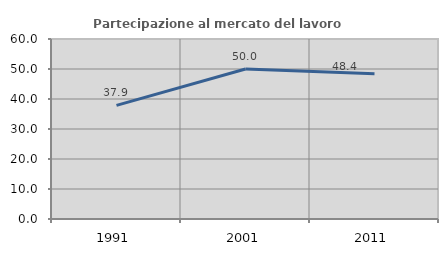
| Category | Partecipazione al mercato del lavoro  femminile |
|---|---|
| 1991.0 | 37.888 |
| 2001.0 | 50 |
| 2011.0 | 48.378 |